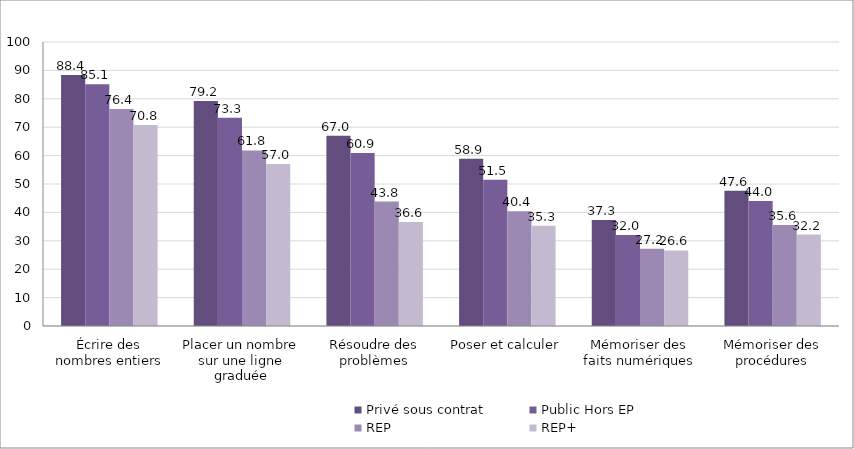
| Category | Privé sous contrat | Public Hors EP | REP | REP+ |
|---|---|---|---|---|
| Écrire des nombres entiers | 88.4 | 85.1 | 76.4 | 70.8 |
| Placer un nombre sur une ligne graduée | 79.2 | 73.3 | 61.8 | 57 |
| Résoudre des problèmes | 67 | 60.9 | 43.8 | 36.6 |
| Poser et calculer | 58.9 | 51.5 | 40.4 | 35.3 |
| Mémoriser des faits numériques | 37.3 | 32 | 27.2 | 26.6 |
| Mémoriser des procédures | 47.6 | 44 | 35.6 | 32.2 |